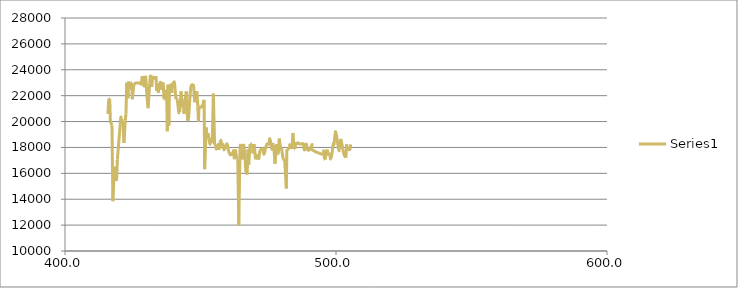
| Category | Series 0 |
|---|---|
| 415.8333333333333 | 20578.584 |
| 416.1666666666667 | 21775.956 |
| 416.5 | 21766.849 |
| 416.75 | 20025.253 |
| 417.3333333333333 | 19674.092 |
| 417.6666666666667 | 13850.174 |
| 418.25 | 16515.152 |
| 418.5 | 16021.505 |
| 418.8333333333333 | 16406.036 |
| 419.0 | 15403.747 |
| 419.3333333333333 | 17060.086 |
| 420.5 | 20096.801 |
| 420.75 | 20173.435 |
| 421.3333333333333 | 20054.714 |
| 421.75 | 18356.375 |
| 422.25 | 20101.01 |
| 422.5 | 20630.397 |
| 422.75 | 23002.874 |
| 423.25 | 21794.171 |
| 423.5 | 23102.119 |
| 423.75 | 22471.91 |
| 424.25 | 23025.048 |
| 424.5833333333333 | 22976.879 |
| 424.8333333333333 | 21721.311 |
| 425.4166666666667 | 22880.539 |
| 425.9166666666667 | 22957.611 |
| 426.1666666666667 | 22976.879 |
| 427.0833333333333 | 22976.879 |
| 427.5 | 22988.506 |
| 427.9166666666667 | 22940.613 |
| 428.1666666666667 | 22919.075 |
| 428.5 | 23520.71 |
| 428.8333333333333 | 23034.682 |
| 429.25 | 22752.381 |
| 429.75 | 23530.572 |
| 430.3333333333333 | 21739.526 |
| 430.6666666666667 | 21031.746 |
| 431.25 | 22947.977 |
| 431.5 | 23570.02 |
| 431.75 | 23589.744 |
| 432.0 | 22666.667 |
| 432.3333333333333 | 23471.4 |
| 433.44166666666666 | 23284.024 |
| 433.5833333333333 | 23500.986 |
| 433.8333333333333 | 22359.551 |
| 434.1666666666667 | 22863.985 |
| 434.4583333333333 | 22206.704 |
| 434.75 | 22986.513 |
| 435.0833333333333 | 22976.879 |
| 435.25 | 23005.78 |
| 435.625 | 22467.043 |
| 435.8333333333333 | 22863.985 |
| 436.25 | 23025.048 |
| 436.5 | 21730.419 |
| 436.7916666666667 | 21730.419 |
| 437.25 | 22331.461 |
| 437.5 | 22340.824 |
| 437.75 | 19251.208 |
| 438.0 | 22854.406 |
| 438.3333333333333 | 19686.469 |
| 438.5416666666667 | 22359.551 |
| 438.7916666666667 | 22844.828 |
| 439.125 | 22883.142 |
| 439.375 | 22206.704 |
| 439.625 | 22873.563 |
| 439.9166666666667 | 22986.513 |
| 440.1666666666667 | 22996.146 |
| 440.4166666666667 | 22967.245 |
| 440.9166666666667 | 21721.311 |
| 441.1666666666667 | 21721.311 |
| 441.375 | 21703.097 |
| 441.75 | 21125.887 |
| 442.0 | 20694.444 |
| 442.3333333333333 | 20711.806 |
| 442.8333333333333 | 22340.824 |
| 443.3333333333333 | 21161.348 |
| 443.5833333333333 | 21684.882 |
| 443.9166666666667 | 20595.855 |
| 444.1666666666667 | 21117.021 |
| 444.375 | 21712.204 |
| 444.75 | 22331.461 |
| 445.0 | 21757.741 |
| 445.2083333333333 | 20067.34 |
| 445.4583333333333 | 20067.34 |
| 445.7083333333333 | 20578.584 |
| 446.25 | 22312.734 |
| 446.625 | 22796.935 |
| 446.875 | 22806.513 |
| 447.1666666666667 | 22854.406 |
| 447.4166666666667 | 22883.142 |
| 447.8333333333333 | 21495.495 |
| 448.0833333333333 | 22340.824 |
| 448.4166666666667 | 21684.882 |
| 448.6666666666667 | 22331.461 |
| 449.0 | 21152.482 |
| 449.25 | 19991.625 |
| 449.4583333333333 | 21143.617 |
| 449.75 | 21152.482 |
| 449.9583333333333 | 21143.617 |
| 450.5833333333333 | 21143.617 |
| 451.3333333333333 | 21675.774 |
| 451.5416666666667 | 16316.872 |
| 452.0833333333333 | 19548.44 |
| 452.4166666666667 | 18757.862 |
| 452.7916666666667 | 19110.577 |
| 453.0833333333333 | 18669.797 |
| 453.5 | 18241.59 |
| 453.9166666666667 | 18661.972 |
| 454.3333333333333 | 18333.333 |
| 454.75 | 22159.624 |
| 455.2083333333333 | 18211.009 |
| 455.5416666666667 | 18226.3 |
| 455.8333333333333 | 17855.007 |
| 456.5 | 18233.945 |
| 456.7916666666667 | 17817.638 |
| 457.1666666666667 | 18241.59 |
| 457.5 | 18566.978 |
| 457.7916666666667 | 18241.59 |
| 458.1666666666667 | 18241.59 |
| 458.6666666666667 | 17810.164 |
| 459.5416666666667 | 18241.59 |
| 459.875 | 18226.3 |
| 460.25 | 17825.112 |
| 460.9166666666667 | 17441.52 |
| 461.375 | 17518.355 |
| 461.5833333333333 | 17463.45 |
| 461.8333333333333 | 17456.14 |
| 462.25 | 17832.586 |
| 462.5 | 17095.851 |
| 462.875 | 17840.06 |
| 463.4166666666667 | 17088.698 |
| 463.75 | 17074.392 |
| 464.125 | 11956.957 |
| 464.5833333333333 | 18016.591 |
| 464.7916666666667 | 18272.171 |
| 465.4166666666667 | 17074.392 |
| 465.5833333333333 | 17862.481 |
| 465.9166666666667 | 18272.171 |
| 466.25 | 17810.164 |
| 466.75 | 16113.36 |
| 467.2083333333333 | 15906.667 |
| 467.5416666666667 | 17840.06 |
| 467.7916666666667 | 16659.693 |
| 468.2916666666667 | 18264.526 |
| 468.8333333333333 | 18249.235 |
| 469.125 | 18264.526 |
| 469.375 | 17540.382 |
| 469.75 | 18264.526 |
| 470.0 | 17855.007 |
| 470.2916666666667 | 17081.545 |
| 471.125 | 17463.45 |
| 471.4583333333333 | 17060.086 |
| 472.0 | 17855.007 |
| 472.4166666666667 | 17862.481 |
| 472.9166666666667 | 17862.481 |
| 473.4166666666667 | 17470.76 |
| 473.9166666666667 | 17855.007 |
| 474.5 | 18264.526 |
| 475.2083333333333 | 18272.171 |
| 475.5833333333333 | 18685.446 |
| 476.0 | 18233.945 |
| 476.3333333333333 | 17855.007 |
| 476.6666666666667 | 18241.59 |
| 477.0 | 18188.737 |
| 477.5 | 16736.695 |
| 478.0 | 18264.526 |
| 478.4166666666667 | 17470.76 |
| 478.6666666666667 | 17470.76 |
| 479.0833333333333 | 18693.271 |
| 479.3333333333333 | 18272.171 |
| 479.75 | 17862.481 |
| 480.0 | 17869.955 |
| 480.2083333333333 | 17478.07 |
| 480.5833333333333 | 17103.004 |
| 481.0 | 17110.157 |
| 481.2083333333333 | 16487.603 |
| 481.6666666666667 | 14826.518 |
| 481.875 | 17884.903 |
| 482.8333333333333 | 17877.429 |
| 483.0 | 18295.107 |
| 483.4166666666667 | 17877.429 |
| 483.8333333333333 | 18279.817 |
| 484.125 | 19110.577 |
| 484.5 | 17884.903 |
| 484.8333333333333 | 17892.377 |
| 485.1666666666667 | 18287.462 |
| 485.625 | 18295.107 |
| 485.9166666666667 | 18364.055 |
| 486.4583333333333 | 18279.817 |
| 486.875 | 18264.526 |
| 487.2083333333333 | 18272.171 |
| 487.9166666666667 | 18272.171 |
| 488.2083333333333 | 17855.007 |
| 488.5 | 17847.534 |
| 488.75 | 18181.126 |
| 489.125 | 18233.945 |
| 489.5 | 17840.06 |
| 490.2916666666667 | 17825.112 |
| 491.1666666666667 | 18233.945 |
| 491.1666666666667 | 17825.112 |
| 495.25 | 17470.76 |
| 495.5 | 17825.112 |
| 495.75 | 17088.698 |
| 496.0 | 17060.086 |
| 496.25 | 17511.013 |
| 496.5 | 17441.52 |
| 496.75 | 17840.06 |
| 497.0 | 17470.76 |
| 497.4166666666667 | 17463.45 |
| 497.7083333333333 | 17478.07 |
| 498.0 | 17095.851 |
| 498.4583333333333 | 17463.45 |
| 499.0 | 18264.526 |
| 499.25 | 18233.945 |
| 499.5 | 18669.797 |
| 499.75 | 19110.577 |
| 500.0 | 19110.577 |
| 501.0 | 17847.534 |
| 501.25 | 17832.586 |
| 501.5 | 17862.481 |
| 501.75 | 18661.972 |
| 502.1666666666667 | 18256.881 |
| 503.0 | 17434.211 |
| 503.6666666666667 | 17215.007 |
| 503.9166666666667 | 18241.59 |
| 504.2916666666667 | 17825.112 |
| 504.5416666666667 | 17840.06 |
| 504.75 | 17862.481 |
| 505.1666666666667 | 17862.481 |
| 505.4166666666667 | 18241.59 |